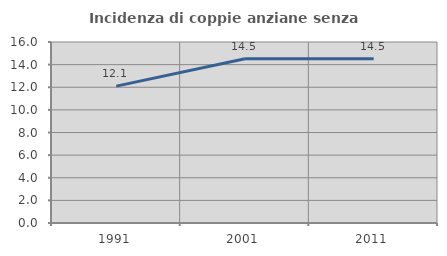
| Category | Incidenza di coppie anziane senza figli  |
|---|---|
| 1991.0 | 12.097 |
| 2001.0 | 14.519 |
| 2011.0 | 14.523 |